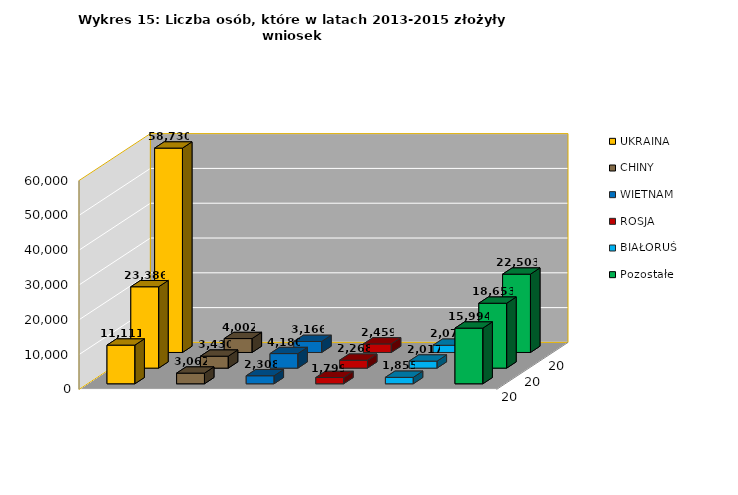
| Category | UKRAINA | CHINY | WIETNAM | ROSJA | BIAŁORUŚ | Pozostałe |
|---|---|---|---|---|---|---|
| 2013.0 | 11111 | 3062 | 2308 | 1799 | 1855 | 15994 |
| 2014.0 | 23386 | 3430 | 4180 | 2268 | 2017 | 18653 |
| 2015.0 | 58730 | 4002 | 3166 | 2459 | 2072 | 22503 |